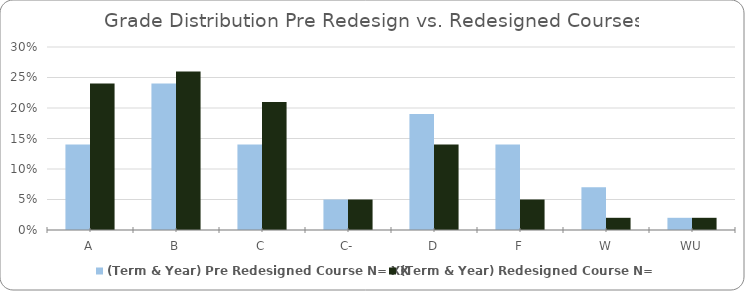
| Category | (Term & Year) Pre Redesigned Course N= XX | (Term & Year) Redesigned Course N=YY |
|---|---|---|
| A | 0.14 | 0.24 |
| B | 0.24 | 0.26 |
| C | 0.14 | 0.21 |
| C- | 0.05 | 0.05 |
| D | 0.19 | 0.14 |
| F | 0.14 | 0.05 |
| W | 0.07 | 0.02 |
| WU | 0.02 | 0.02 |